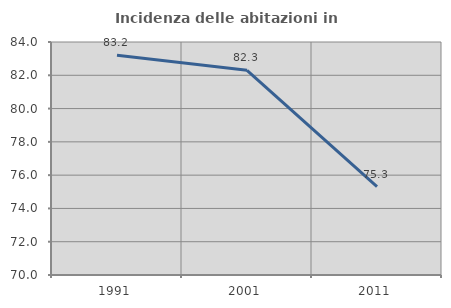
| Category | Incidenza delle abitazioni in proprietà  |
|---|---|
| 1991.0 | 83.21 |
| 2001.0 | 82.296 |
| 2011.0 | 75.313 |